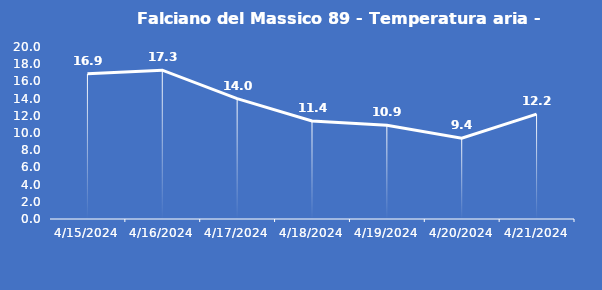
| Category | Falciano del Massico 89 - Temperatura aria - Grezzo (°C) |
|---|---|
| 4/15/24 | 16.9 |
| 4/16/24 | 17.3 |
| 4/17/24 | 14 |
| 4/18/24 | 11.4 |
| 4/19/24 | 10.9 |
| 4/20/24 | 9.4 |
| 4/21/24 | 12.2 |